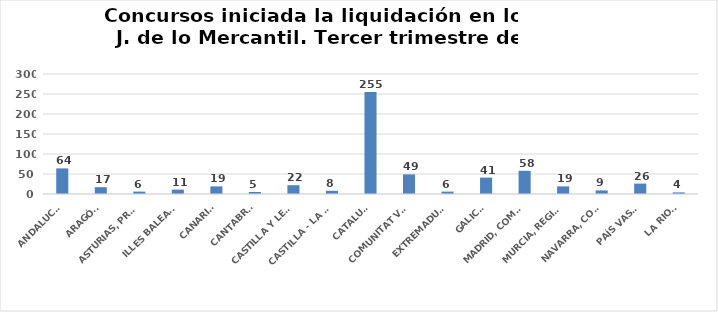
| Category | Series 0 |
|---|---|
| ANDALUCÍA | 64 |
| ARAGÓN | 17 |
| ASTURIAS, PRINCIPADO | 6 |
| ILLES BALEARS | 11 |
| CANARIAS | 19 |
| CANTABRIA | 5 |
| CASTILLA Y LEÓN | 22 |
| CASTILLA - LA MANCHA | 8 |
| CATALUÑA | 255 |
| COMUNITAT VALENCIANA | 49 |
| EXTREMADURA | 6 |
| GALICIA | 41 |
| MADRID, COMUNIDAD | 58 |
| MURCIA, REGIÓN | 19 |
| NAVARRA, COM. FORAL | 9 |
| PAÍS VASCO | 26 |
| LA RIOJA | 4 |